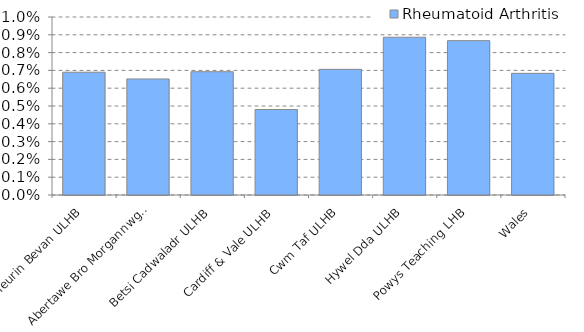
| Category | Rheumatoid Arthritis |
|---|---|
| Aneurin Bevan ULHB | 0.007 |
| Abertawe Bro Morgannwg ULHB | 0.007 |
| Betsi Cadwaladr ULHB | 0.007 |
| Cardiff & Vale ULHB | 0.005 |
| Cwm Taf ULHB | 0.007 |
| Hywel Dda ULHB | 0.009 |
| Powys Teaching LHB | 0.009 |
| Wales | 0.007 |